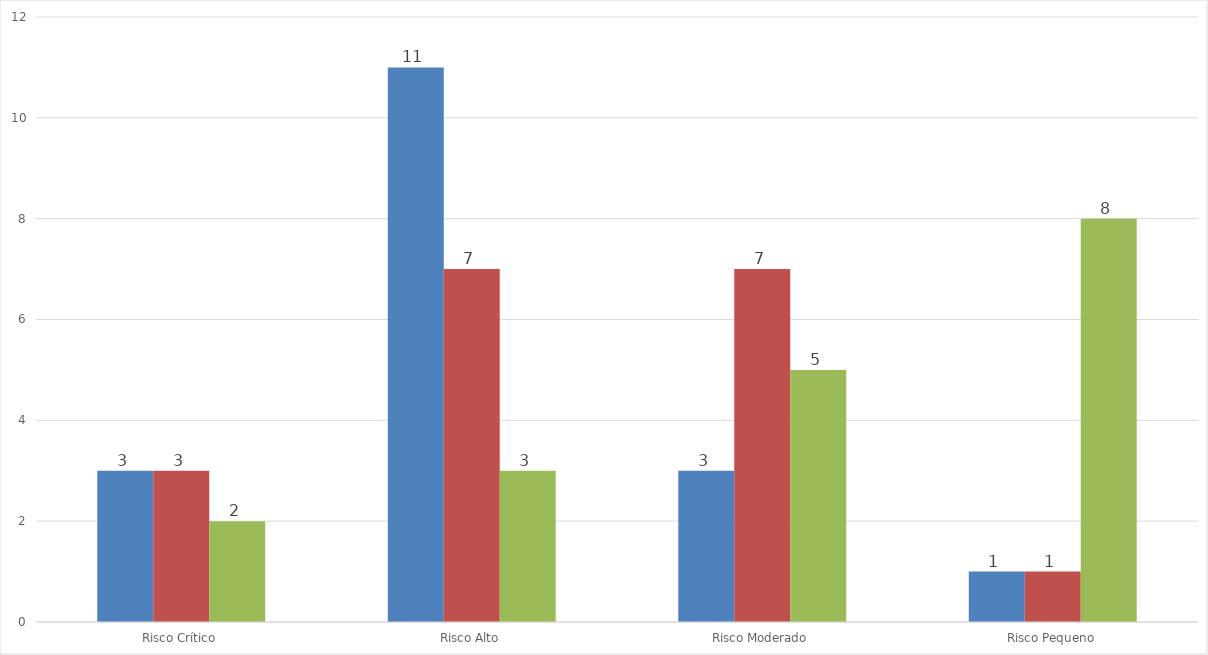
| Category | Series 0 | serie2 | serie3 |
|---|---|---|---|
| Risco Crítico | 3 | 3 | 2 |
| Risco Alto | 11 | 7 | 3 |
| Risco Moderado | 3 | 7 | 5 |
| Risco Pequeno | 1 | 1 | 8 |